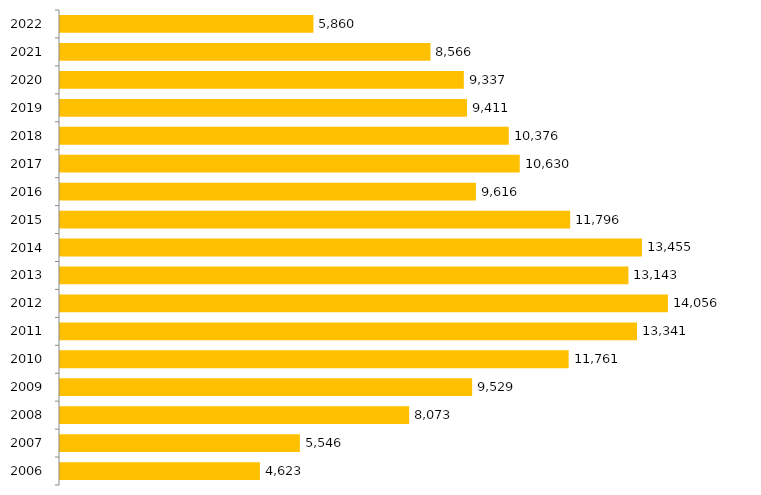
| Category | Inscritos |
|---|---|
| 2006.0 | 4623 |
| 2007.0 | 5546 |
| 2008.0 | 8073 |
| 2009.0 | 9529 |
| 2010.0 | 11761 |
| 2011.0 | 13341 |
| 2012.0 | 14056 |
| 2013.0 | 13143 |
| 2014.0 | 13455 |
| 2015.0 | 11796 |
| 2016.0 | 9616 |
| 2017.0 | 10630 |
| 2018.0 | 10376 |
| 2019.0 | 9411 |
| 2020.0 | 9337 |
| 2021.0 | 8566 |
| 2022.0 | 5860 |